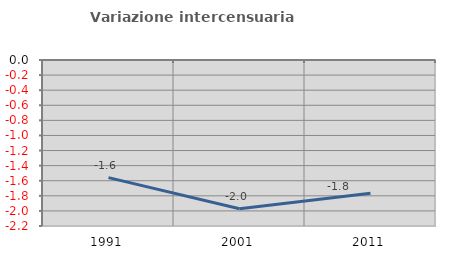
| Category | Variazione intercensuaria annua |
|---|---|
| 1991.0 | -1.559 |
| 2001.0 | -1.972 |
| 2011.0 | -1.765 |